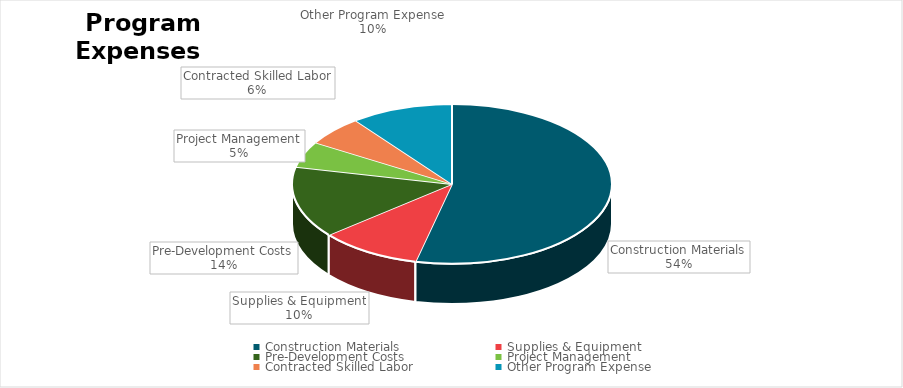
| Category | Expenditure |
|---|---|
| Construction Materials | 52000 |
| Supplies & Equipment | 10000 |
| Pre-Development Costs | 14000 |
| Project Management | 5100 |
| Contracted Skilled Labor | 5800 |
| Other Program Expense | 10000 |